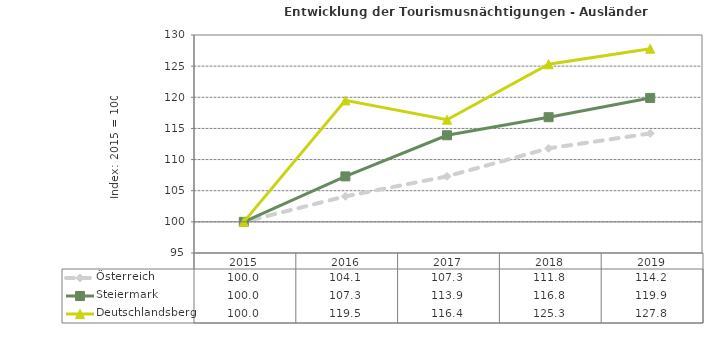
| Category | Österreich | Steiermark | Deutschlandsberg |
|---|---|---|---|
| 2019.0 | 114.2 | 119.9 | 127.8 |
| 2018.0 | 111.8 | 116.8 | 125.3 |
| 2017.0 | 107.3 | 113.9 | 116.4 |
| 2016.0 | 104.1 | 107.3 | 119.5 |
| 2015.0 | 100 | 100 | 100 |